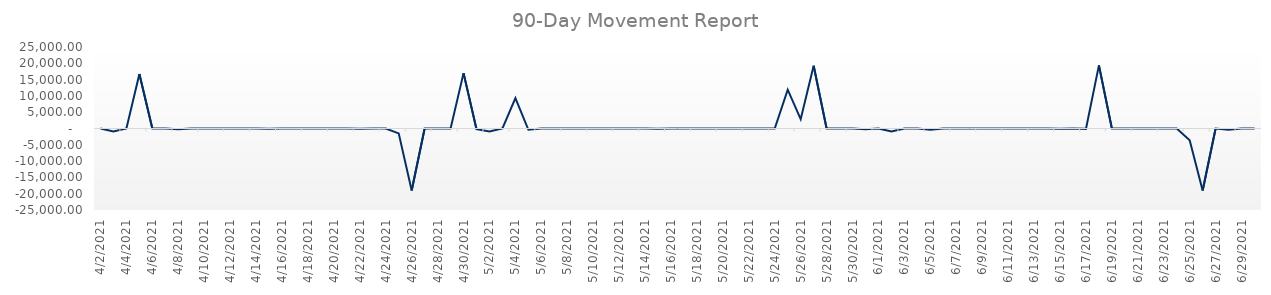
| Category | Value |
|---|---|
| 4/2/21 | 0 |
| 4/3/21 | -912 |
| 4/4/21 | 0 |
| 4/5/21 | 16735.2 |
| 4/6/21 | 0 |
| 4/7/21 | 0 |
| 4/8/21 | -228 |
| 4/9/21 | 0 |
| 4/10/21 | 0 |
| 4/11/21 | 0 |
| 4/12/21 | 0 |
| 4/13/21 | 0 |
| 4/14/21 | 0 |
| 4/15/21 | -57 |
| 4/16/21 | 0 |
| 4/17/21 | 0 |
| 4/18/21 | 0 |
| 4/19/21 | 0 |
| 4/20/21 | 0 |
| 4/21/21 | 0 |
| 4/22/21 | -59.28 |
| 4/23/21 | 0 |
| 4/24/21 | 0 |
| 4/25/21 | -1500 |
| 4/26/21 | -19020 |
| 4/27/21 | 0 |
| 4/28/21 | 0 |
| 4/29/21 | 0 |
| 4/30/21 | 16986 |
| 5/1/21 | -204.06 |
| 5/2/21 | -912 |
| 5/3/21 | 0 |
| 5/4/21 | 9311.52 |
| 5/5/21 | -387.6 |
| 5/6/21 | 0 |
| 5/7/21 | 0 |
| 5/8/21 | 0 |
| 5/9/21 | 0 |
| 5/10/21 | 0 |
| 5/11/21 | 0 |
| 5/12/21 | 0 |
| 5/13/21 | 0 |
| 5/14/21 | 0 |
| 5/15/21 | -57 |
| 5/16/21 | 0 |
| 5/17/21 | 0 |
| 5/18/21 | 0 |
| 5/19/21 | 0 |
| 5/20/21 | 0 |
| 5/21/21 | 0 |
| 5/22/21 | 0 |
| 5/23/21 | 0 |
| 5/24/21 | 0 |
| 5/25/21 | 11913 |
| 5/26/21 | 2868 |
| 5/27/21 | 19246.62 |
| 5/28/21 | 0 |
| 5/29/21 | 0 |
| 5/30/21 | 0 |
| 5/31/21 | -204.06 |
| 6/1/21 | 0 |
| 6/2/21 | -912 |
| 6/3/21 | 0 |
| 6/4/21 | 0 |
| 6/5/21 | -387.6 |
| 6/6/21 | 0 |
| 6/7/21 | 0 |
| 6/8/21 | 0 |
| 6/9/21 | 0 |
| 6/10/21 | 0 |
| 6/11/21 | 0 |
| 6/12/21 | 0 |
| 6/13/21 | 0 |
| 6/14/21 | 0 |
| 6/15/21 | -57 |
| 6/16/21 | 0 |
| 6/17/21 | -111.72 |
| 6/18/21 | 19365.18 |
| 6/19/21 | 0 |
| 6/20/21 | 0 |
| 6/21/21 | 0 |
| 6/22/21 | 0 |
| 6/23/21 | 0 |
| 6/24/21 | 0 |
| 6/25/21 | -3600 |
| 6/26/21 | -19020 |
| 6/27/21 | 0 |
| 6/28/21 | -351.12 |
| 6/29/21 | 0 |
| 6/30/21 | 0 |